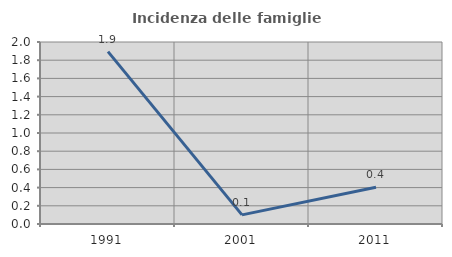
| Category | Incidenza delle famiglie numerose |
|---|---|
| 1991.0 | 1.894 |
| 2001.0 | 0.1 |
| 2011.0 | 0.403 |